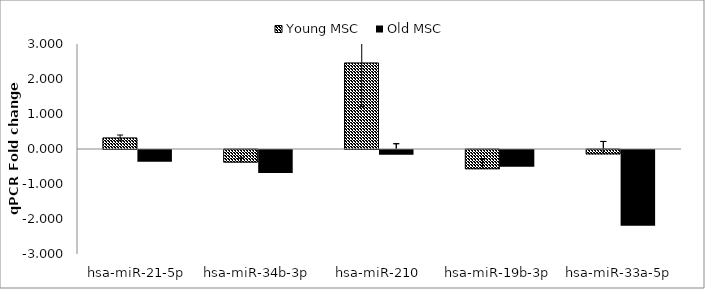
| Category | Young MSC  | Old MSC  |
|---|---|---|
| hsa-miR-21-5p | 0.317 | -0.333 |
| hsa-miR-34b-3p | -0.361 | -0.654 |
| hsa-miR-210 | 2.459 | -0.139 |
| hsa-miR-19b-3p | -0.551 | -0.478 |
| hsa-miR-33a-5p | -0.127 | -2.167 |